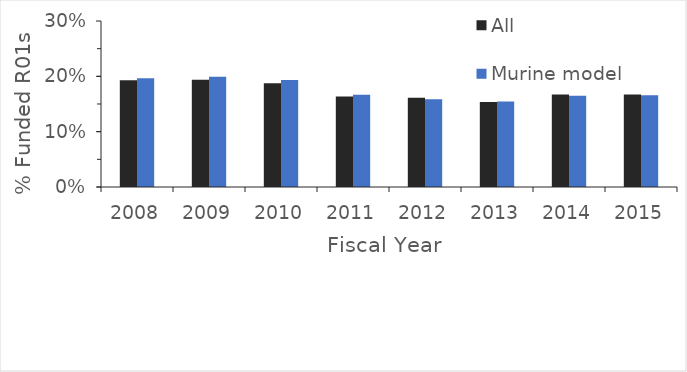
| Category | All | Murine model |
|---|---|---|
| 2008.0 | 0.193 | 0.197 |
| 2009.0 | 0.194 | 0.199 |
| 2010.0 | 0.187 | 0.193 |
| 2011.0 | 0.164 | 0.167 |
| 2012.0 | 0.161 | 0.159 |
| 2013.0 | 0.154 | 0.155 |
| 2014.0 | 0.167 | 0.165 |
| 2015.0 | 0.167 | 0.166 |